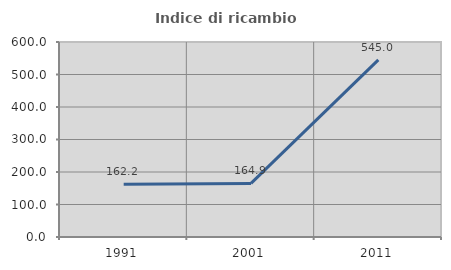
| Category | Indice di ricambio occupazionale  |
|---|---|
| 1991.0 | 162.162 |
| 2001.0 | 164.865 |
| 2011.0 | 545 |